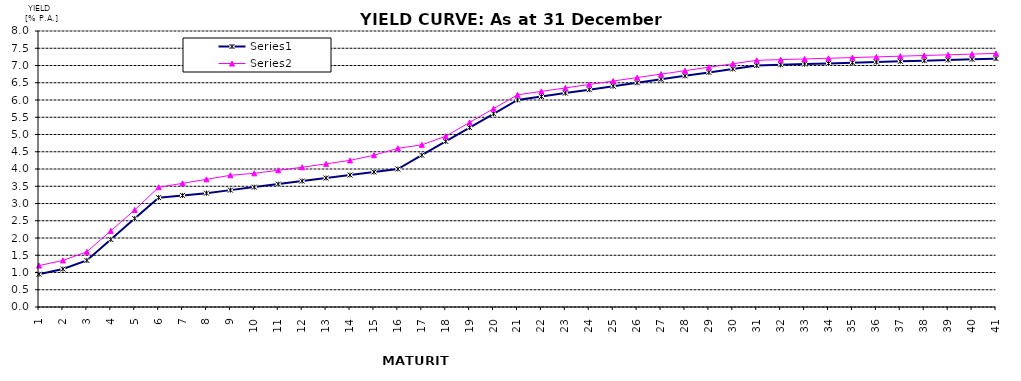
| Category | Series 0 | Series 1 |
|---|---|---|
| 0 | 0.95 | 1.2 |
| 1 | 1.1 | 1.35 |
| 2 | 1.35 | 1.6 |
| 3 | 1.957 | 2.207 |
| 4 | 2.563 | 2.813 |
| 5 | 3.17 | 3.47 |
| 6 | 3.235 | 3.585 |
| 7 | 3.3 | 3.7 |
| 8 | 3.387 | 3.818 |
| 9 | 3.475 | 3.875 |
| 10 | 3.562 | 3.962 |
| 11 | 3.65 | 4.05 |
| 12 | 3.737 | 4.15 |
| 13 | 3.825 | 4.25 |
| 14 | 3.912 | 4.4 |
| 15 | 4 | 4.6 |
| 16 | 4.4 | 4.7 |
| 17 | 4.8 | 4.95 |
| 18 | 5.2 | 5.35 |
| 19 | 5.6 | 5.75 |
| 20 | 6 | 6.15 |
| 21 | 6.1 | 6.25 |
| 22 | 6.2 | 6.35 |
| 23 | 6.3 | 6.45 |
| 24 | 6.4 | 6.55 |
| 25 | 6.5 | 6.65 |
| 26 | 6.6 | 6.75 |
| 27 | 6.7 | 6.85 |
| 28 | 6.8 | 6.95 |
| 29 | 6.9 | 7.05 |
| 30 | 7 | 7.15 |
| 31 | 7.02 | 7.17 |
| 32 | 7.04 | 7.19 |
| 33 | 7.06 | 7.21 |
| 34 | 7.08 | 7.23 |
| 35 | 7.1 | 7.25 |
| 36 | 7.12 | 7.27 |
| 37 | 7.14 | 7.29 |
| 38 | 7.16 | 7.31 |
| 39 | 7.18 | 7.33 |
| 40 | 7.2 | 7.35 |